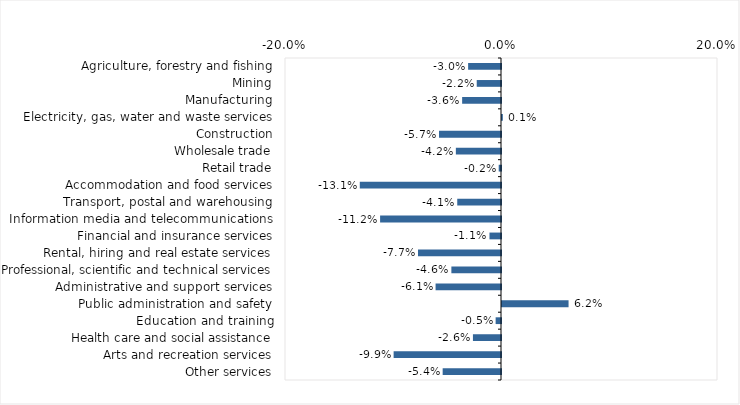
| Category | This week |
|---|---|
| Agriculture, forestry and fishing | -0.03 |
| Mining | -0.022 |
| Manufacturing | -0.036 |
| Electricity, gas, water and waste services | 0.001 |
| Construction | -0.057 |
| Wholesale trade | -0.042 |
| Retail trade | -0.002 |
| Accommodation and food services | -0.131 |
| Transport, postal and warehousing | -0.041 |
| Information media and telecommunications | -0.112 |
| Financial and insurance services | -0.011 |
| Rental, hiring and real estate services | -0.077 |
| Professional, scientific and technical services | -0.046 |
| Administrative and support services | -0.061 |
| Public administration and safety | 0.062 |
| Education and training | -0.005 |
| Health care and social assistance | -0.026 |
| Arts and recreation services | -0.099 |
| Other services | -0.054 |